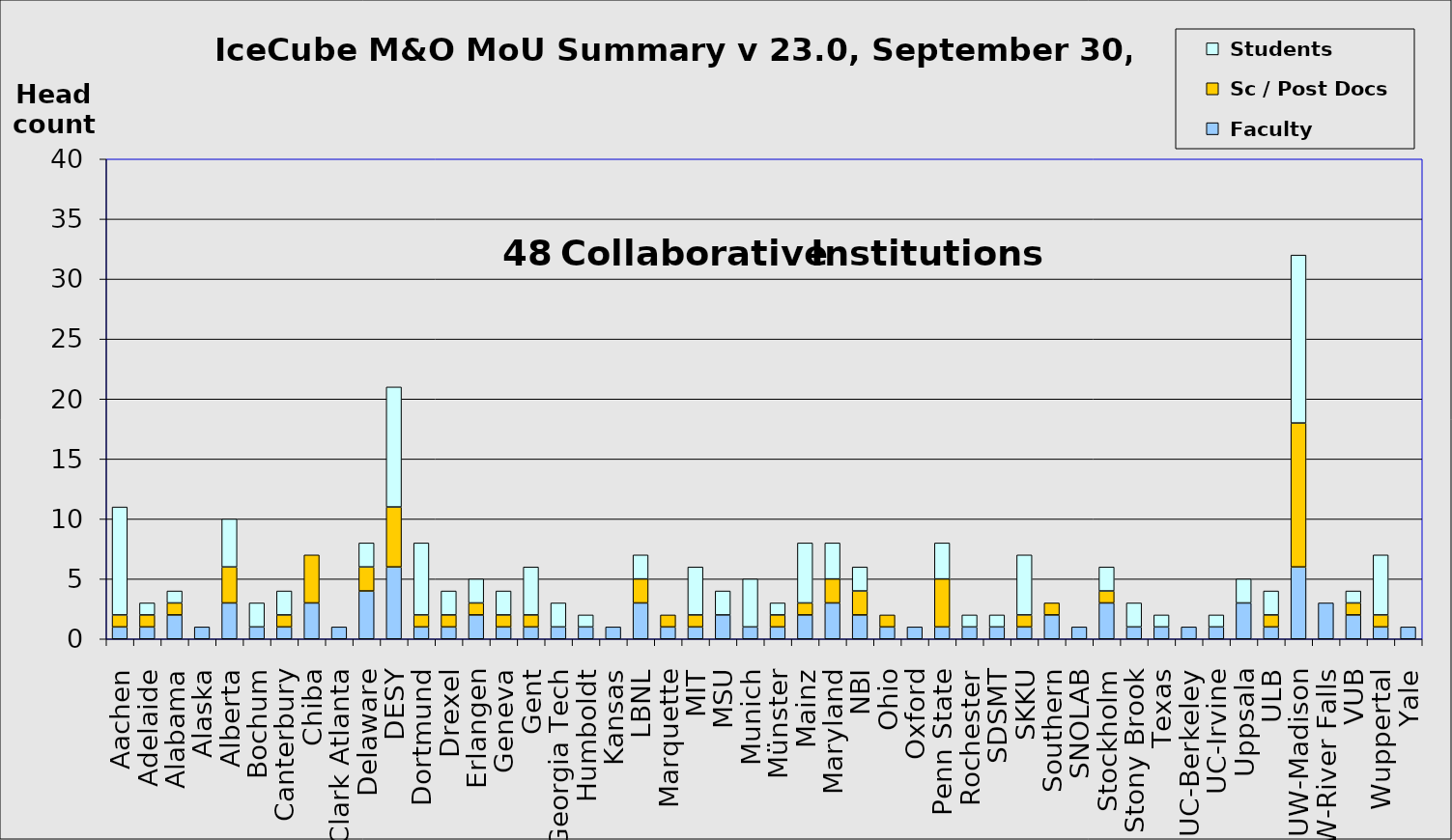
| Category |  Faculty |  Sc / Post Docs |  Students |
|---|---|---|---|
| Aachen | 1 | 1 | 9 |
| Adelaide | 1 | 1 | 1 |
| Alabama | 2 | 1 | 1 |
| Alaska | 1 | 0 | 0 |
| Alberta | 3 | 3 | 4 |
| Bochum | 1 | 0 | 2 |
| Canterbury | 1 | 1 | 2 |
| Chiba | 3 | 4 | 0 |
| Clark Atlanta | 1 | 0 | 0 |
| Delaware | 4 | 2 | 2 |
| DESY | 6 | 5 | 10 |
| Dortmund | 1 | 1 | 6 |
| Drexel | 1 | 1 | 2 |
| Erlangen | 2 | 1 | 2 |
| Geneva | 1 | 1 | 2 |
| Gent | 1 | 1 | 4 |
| Georgia Tech | 1 | 0 | 2 |
| Humboldt | 1 | 0 | 1 |
| Kansas | 1 | 0 | 0 |
| LBNL | 3 | 2 | 2 |
| Marquette | 1 | 1 | 0 |
| MIT | 1 | 1 | 4 |
| MSU | 2 | 0 | 2 |
| Munich | 1 | 0 | 4 |
| Münster | 1 | 1 | 1 |
| Mainz | 2 | 1 | 5 |
| Maryland | 3 | 2 | 3 |
| NBI | 2 | 2 | 2 |
| Ohio | 1 | 1 | 0 |
| Oxford | 1 | 0 | 0 |
| Penn State | 1 | 4 | 3 |
| Rochester | 1 | 0 | 1 |
| SDSMT | 1 | 0 | 1 |
| SKKU | 1 | 1 | 5 |
| Southern | 2 | 1 | 0 |
| SNOLAB | 1 | 0 | 0 |
| Stockholm | 3 | 1 | 2 |
| Stony Brook | 1 | 0 | 2 |
| Texas | 1 | 0 | 1 |
| UC-Berkeley | 1 | 0 | 0 |
| UC-Irvine | 1 | 0 | 1 |
| Uppsala | 3 | 0 | 2 |
| ULB | 1 | 1 | 2 |
| UW-Madison | 6 | 12 | 14 |
| UW-River Falls | 3 | 0 | 0 |
| VUB | 2 | 1 | 1 |
| Wuppertal | 1 | 1 | 5 |
| Yale | 1 | 0 | 0 |